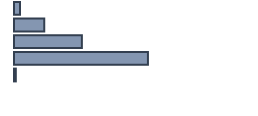
| Category | Percentatge |
|---|---|
| 0 | 2.525 |
| 1 | 12.626 |
| 2 | 28.283 |
| 3 | 55.808 |
| 4 | 0.758 |
| 5 | 0 |